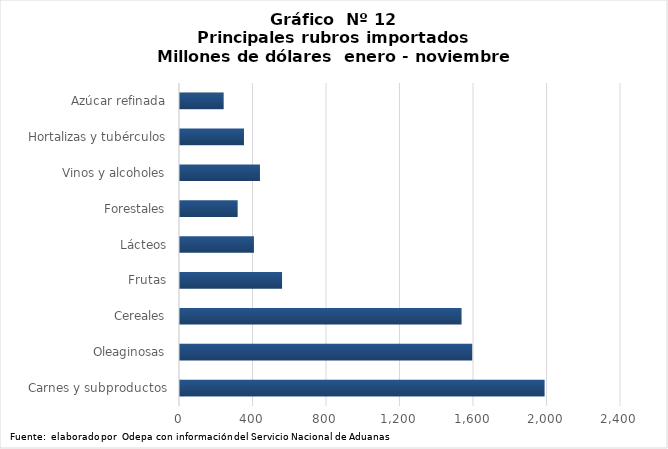
| Category | Series 0 |
|---|---|
| Carnes y subproductos | 1984181.747 |
| Oleaginosas | 1590289.929 |
| Cereales | 1532307.44 |
| Frutas | 555459.863 |
| Lácteos | 402390.246 |
| Forestales | 313746 |
| Vinos y alcoholes | 435188.601 |
| Hortalizas y tubérculos | 348136.193 |
| Azúcar refinada | 237647.65 |